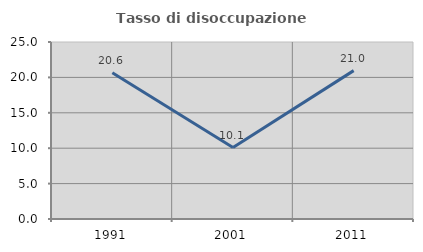
| Category | Tasso di disoccupazione giovanile  |
|---|---|
| 1991.0 | 20.649 |
| 2001.0 | 10.096 |
| 2011.0 | 20.958 |